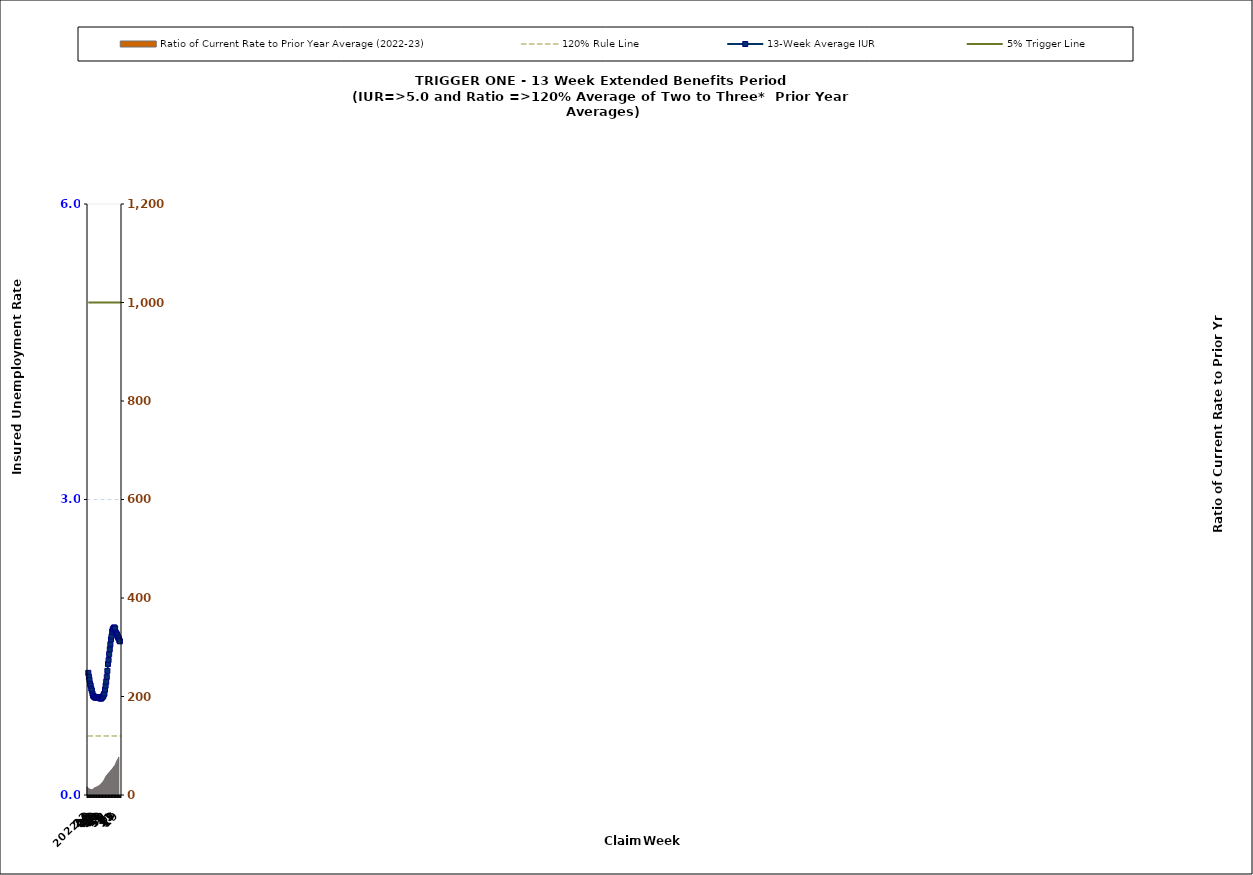
| Category | Ratio of Current Rate to Prior Year Average (2022-23) |
|---|---|
| 2022-20 | 16.5 |
| 21 | 15.17 |
| 22 | 14.15 |
| 23 | 13.13 |
| 24 | 12.39 |
| 25 | 11.71 |
| 26 | 11.42 |
| 27 | 11.26 |
| 28 | 11.28 |
| 29 | 11.5 |
| 30 | 11.91 |
| 31 | 12.53 |
| 32 | 14.12 |
| 33 | 14.93 |
| 34 | 15.49 |
| 35 | 15.96 |
| 36 | 16.45 |
| 37 | 16.93 |
| 38 | 17.56 |
| 39 | 18.26 |
| 40 | 18.97 |
| 41 | 19.91 |
| 42 | 20.94 |
| 43 | 22.27 |
| 44 | 23.58 |
| 45 | 24.66 |
| 46 | 26.18 |
| 47 | 27.5 |
| 48 | 29.43 |
| 49 | 31.48 |
| 50 | 33.92 |
| 51 | 36.41 |
| 52 | 38.59 |
| 53 | 40.12 |
| 1 | 41.26 |
| 2 | 43 |
| 3 | 44.37 |
| 4 | 45.67 |
| 5 | 47.09 |
| 6 | 48.27 |
| 7 | 50 |
| 8 | 51.53 |
| 9 | 52.73 |
| 10 | 54.22 |
| 11 | 55.92 |
| 12 | 57.97 |
| 13 | 58.82 |
| 14 | 61.19 |
| 15 | 63.79 |
| 16 | 66.8 |
| 17 | 69.41 |
| 18 | 71.78 |
| 19 | 73.7 |
| 2023-20 | 77.22 |